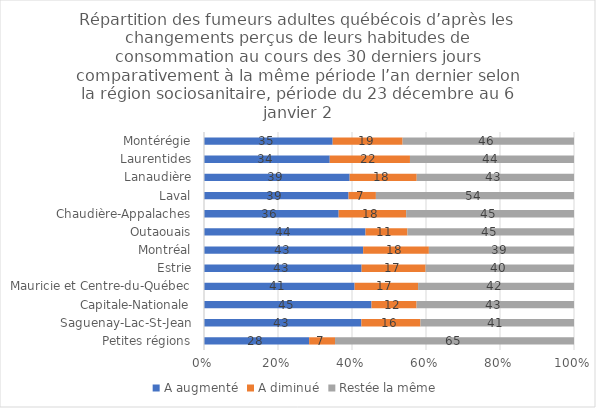
| Category | A augmenté | A diminué | Restée la même |
|---|---|---|---|
| Petites régions | 28.413 | 6.999 | 64.589 |
| Saguenay-Lac-St-Jean | 42.538 | 15.973 | 41.489 |
| Capitale-Nationale | 45.275 | 12.184 | 42.541 |
| Mauricie et Centre-du-Québec | 40.707 | 17.153 | 42.14 |
| Estrie | 42.598 | 17.299 | 40.103 |
| Montréal | 43.012 | 17.766 | 39.222 |
| Outaouais | 43.653 | 11.337 | 45.01 |
| Chaudière-Appalaches | 36.397 | 18.243 | 45.36 |
| Laval | 39.07 | 7.39 | 53.541 |
| Lanaudière | 39.376 | 18.119 | 42.504 |
| Laurentides | 33.99 | 21.676 | 44.335 |
| Montérégie | 34.779 | 18.902 | 46.319 |